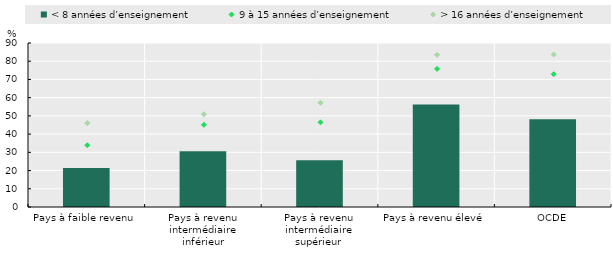
| Category | < 8 années d’enseignement |
|---|---|
| Pays à faible revenu | 21.4 |
| Pays à revenu intermédiaire inférieur | 30.6 |
| Pays à revenu intermédiaire supérieur | 25.6 |
| Pays à revenu élevé | 56.2 |
| OCDE | 48.2 |